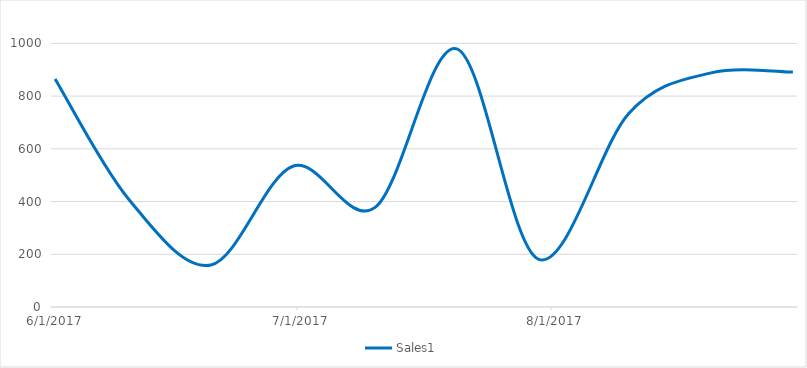
| Category | Sales1 |
|---|---|
| 6/1/17 | 865 |
| 6/10/17 | 408 |
| 6/20/17 | 159 |
| 6/30/17 | 534 |
| 7/10/17 | 377 |
| 7/20/17 | 979 |
| 7/30/17 | 181 |
| 8/10/17 | 735 |
| 8/20/17 | 888 |
| 8/30/17 | 891 |